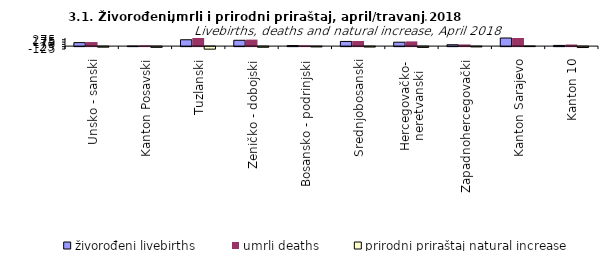
| Category | živorođeni livebirths | umrli deaths | prirodni priraštaj natural increase |
|---|---|---|---|
| Unsko - sanski | 150 | 175 | -25 |
| Kanton Posavski | 3 | 36 | -33 |
| Tuzlanski | 274 | 384 | -110 |
| Zeničko - dobojski | 251 | 280 | -29 |
| Bosansko - podrinjski | 22 | 36 | -14 |
| Srednjobosanski | 202 | 221 | -19 |
| Hercegovačko-
neretvanski | 168 | 203 | -35 |
| Zapadnohercegovački | 59 | 72 | -13 |
| Kanton Sarajevo | 376 | 371 | 5 |
| Kanton 10 | 29 | 69 | -40 |